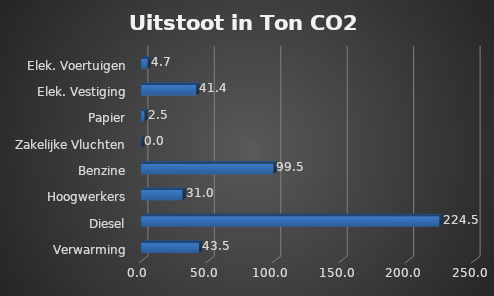
| Category | Series 0 |
|---|---|
| Verwarming | 43.453 |
| Diesel | 224.485 |
| Hoogwerkers | 31.018 |
| Benzine | 99.453 |
| Zakelijke Vluchten | 0 |
| Papier | 2.496 |
| Elek. Vestiging | 41.433 |
| Elek. Voertuigen | 4.744 |